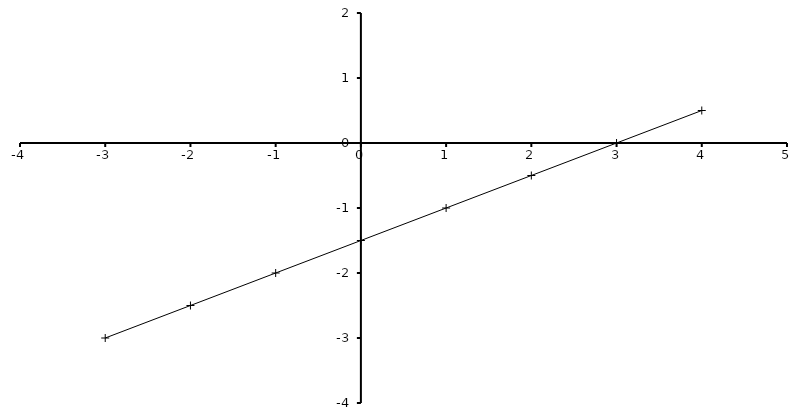
| Category | Series 0 |
|---|---|
| -3.0 | -3 |
| -2.0 | -2.5 |
| -1.0 | -2 |
| 0.0 | -1.5 |
| 1.0 | -1 |
| 2.0 | -0.5 |
| 3.0 | 0 |
| 4.0 | 0.5 |